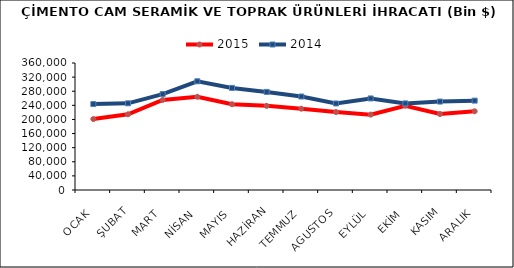
| Category | 2015 | 2014 |
|---|---|---|
| OCAK | 201065.28 | 243544.678 |
| ŞUBAT | 214556.046 | 245731.01 |
| MART | 255295.891 | 271914.173 |
| NİSAN | 264134.792 | 308165.531 |
| MAYIS | 243076.363 | 289412.996 |
| HAZİRAN | 238478.827 | 278037.819 |
| TEMMUZ | 230423.559 | 265000.489 |
| AGUSTOS | 220953.857 | 245294.256 |
| EYLÜL | 213663.71 | 259554.494 |
| EKİM | 238874.909 | 245503.62 |
| KASIM | 215428.031 | 250694.559 |
| ARALIK | 223153.068 | 253341.653 |